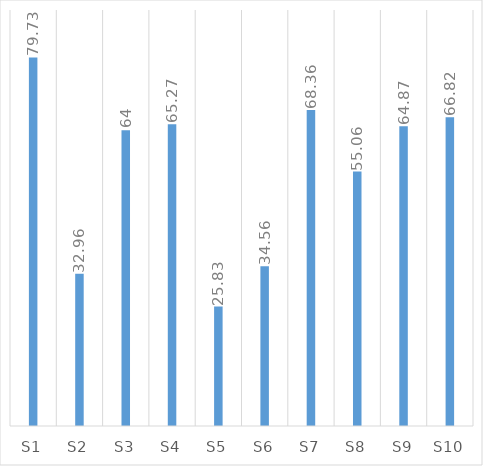
| Category | Mean |
|---|---|
| S1 | 79.73 |
| S2 | 32.96 |
| S3 | 64 |
| S4 | 65.27 |
| S5 | 25.83 |
| S6 | 34.56 |
| S7 | 68.36 |
| S8 | 55.06 |
| S9 | 64.87 |
| S10 | 66.82 |